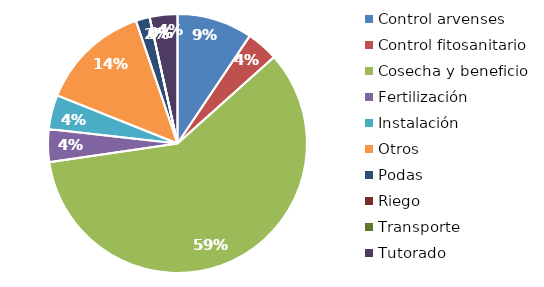
| Category | Valor |
|---|---|
| Control arvenses | 3040000 |
| Control fitosanitario | 1280000 |
| Cosecha y beneficio | 19160000 |
| Fertilización | 1320000 |
| Instalación | 1380000 |
| Otros | 4440000 |
| Podas | 560000 |
| Riego | 0 |
| Transporte | 0 |
| Tutorado | 1120000 |